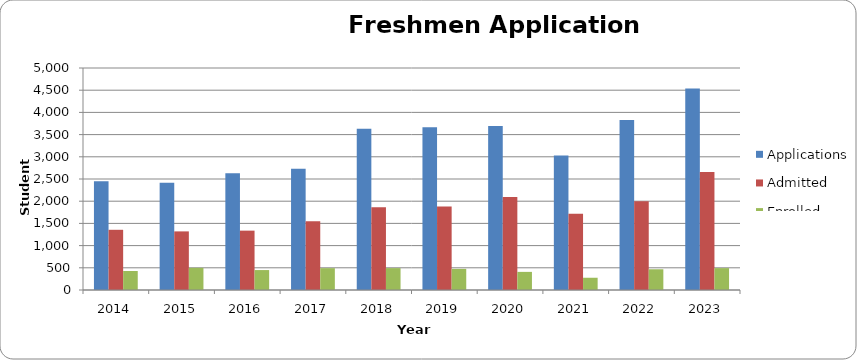
| Category | Applications | Admitted | Enrolled |
|---|---|---|---|
| 2014.0 | 2447 | 1356 | 428 |
| 2015.0 | 2413 | 1320 | 499 |
| 2016.0 | 2632 | 1337 | 449 |
| 2017.0 | 2729 | 1549 | 492 |
| 2018.0 | 3629 | 1863 | 493 |
| 2019.0 | 3668 | 1878 | 476 |
| 2020.0 | 3693 | 2096 | 408 |
| 2021.0 | 3032 | 1719 | 276 |
| 2022.0 | 3829 | 1998 | 467 |
| 2023.0 | 4536 | 2657 | 493 |